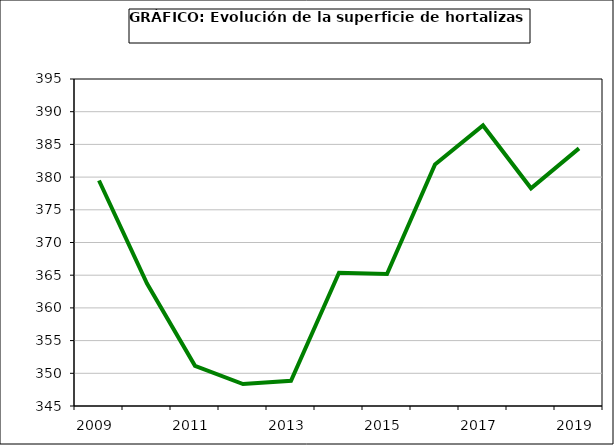
| Category | superficie |
|---|---|
| 2009.0 | 379.479 |
| 2010.0 | 363.729 |
| 2011.0 | 351.145 |
| 2012.0 | 348.359 |
| 2013.0 | 348.853 |
| 2014.0 | 365.385 |
| 2015.0 | 365.178 |
| 2016.0 | 381.94 |
| 2017.0 | 387.895 |
| 2018.0 | 378.294 |
| 2019.0 | 384.392 |